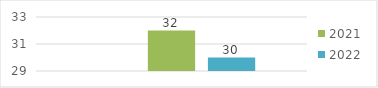
| Category | Enero - Marzo | 2021 | 2022 |
|---|---|---|---|
| 0 |  | 32 | 30 |